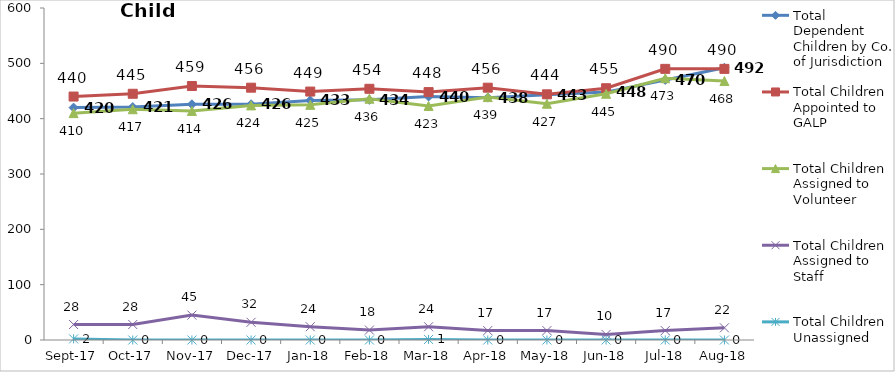
| Category | Total Dependent Children by Co. of Jurisdiction | Total Children Appointed to GALP | Total Children Assigned to Volunteer | Total Children Assigned to Staff | Total Children Unassigned |
|---|---|---|---|---|---|
| 2017-09-01 | 420 | 440 | 410 | 28 | 2 |
| 2017-10-01 | 421 | 445 | 417 | 28 | 0 |
| 2017-11-01 | 426 | 459 | 414 | 45 | 0 |
| 2017-12-01 | 426 | 456 | 424 | 32 | 0 |
| 2018-01-01 | 433 | 449 | 425 | 24 | 0 |
| 2018-02-01 | 434 | 454 | 436 | 18 | 0 |
| 2018-03-01 | 440 | 448 | 423 | 24 | 1 |
| 2018-04-01 | 438 | 456 | 439 | 17 | 0 |
| 2018-05-01 | 443 | 444 | 427 | 17 | 0 |
| 2018-06-01 | 448 | 455 | 445 | 10 | 0 |
| 2018-07-01 | 470 | 490 | 473 | 17 | 0 |
| 2018-08-01 | 492 | 490 | 468 | 22 | 0 |